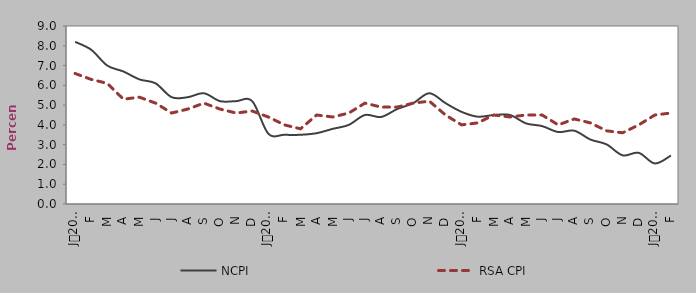
| Category | NCPI | RSA CPI |
|---|---|---|
| 0 | 8.2 | 6.6 |
| 1900-01-01 | 7.8 | 6.3 |
| 1900-01-02 | 7 | 6.1 |
| 1900-01-03 | 6.7 | 5.3 |
| 1900-01-04 | 6.3 | 5.4 |
| 1900-01-05 | 6.1 | 5.1 |
| 1900-01-06 | 5.4 | 4.6 |
| 1900-01-07 | 5.4 | 4.8 |
| 1900-01-08 | 5.6 | 5.1 |
| 1900-01-09 | 5.2 | 4.8 |
| 1900-01-10 | 5.2 | 4.6 |
| 1900-01-11 | 5.2 | 4.7 |
| 1900-01-12 | 3.555 | 4.4 |
| 1900-01-13 | 3.5 | 4 |
| 1900-01-14 | 3.5 | 3.8 |
| 1900-01-15 | 3.581 | 4.5 |
| 1900-01-16 | 3.8 | 4.4 |
| 1900-01-17 | 4 | 4.6 |
| 1900-01-18 | 4.5 | 5.1 |
| 1900-01-19 | 4.4 | 4.9 |
| 1900-01-20 | 4.8 | 4.9 |
| 1900-01-21 | 5.1 | 5.1 |
| 1900-01-22 | 5.6 | 5.2 |
| 1900-01-23 | 5.1 | 4.5 |
| 1900-01-24 | 4.658 | 4 |
| 1900-01-25 | 4.416 | 4.1 |
| 1900-01-26 | 4.498 | 4.5 |
| 1900-01-27 | 4.503 | 4.4 |
| 1900-01-28 | 4.076 | 4.5 |
| 1900-01-29 | 3.939 | 4.5 |
| 1900-01-30 | 3.639 | 4 |
| 1900-01-31 | 3.705 | 4.3 |
| 1900-02-01 | 3.259 | 4.1 |
| 1900-02-02 | 3.015 | 3.7 |
| 1900-02-03 | 2.461 | 3.6 |
| 1900-02-04 | 2.588 | 4 |
| 1900-02-05 | 2.05 | 4.5 |
| 1900-02-06 | 2.45 | 4.6 |